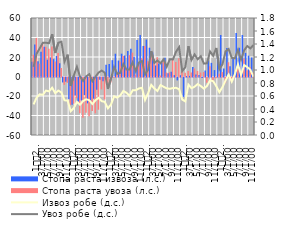
| Category | Стопа раста извоза (л.с.)  | Стопа раста увоза (л.с.)  |
|---|---|---|
| 1
2008. | 15.199 | 22.34 |
| 2 | 32.712 | 39.55 |
| 3 | 15.527 | 13.134 |
| 4 | 25.502 | 34.144 |
| 5 | 30.57 | 30.348 |
| 6 | 17.223 | 28.543 |
| 7 | 19.483 | 30.676 |
| 8 | 17.824 | 15.462 |
| 9 | 21.061 | 24.086 |
| 10 | 13.589 | 8.768 |
| 11 | -5.06 | -7.568 |
| 12 | -4.251 | -5.466 |
| 1
2009. | -22.358 | -28.17 |
| 2 | -27.935 | -26.832 |
| 3 | -18.494 | -21.35 |
| 4 | -24.672 | -36.553 |
| 5 | -23.42 | -41.364 |
| 6 | -18.089 | -36.077 |
| 7 | -26.536 | -39.742 |
| 8 | -25.811 | -34.425 |
| 9 | -21.736 | -36.718 |
| 10 | -12.575 | -33.086 |
| 11 | -2.315 | -12.183 |
| 12 | -3.819 | -22.497 |
| 1
2010. | 12.142 | -5.961 |
| 2 | 12.72 | -5.168 |
| 3 | 16.768 | -0.207 |
| 4 | 23.362 | 4.609 |
| 5 | 16.387 | 15.025 |
| 6 | 23.401 | 21.029 |
| 7 | 21.506 | 7.779 |
| 8 | 26.135 | 21.986 |
| 9 | 28.389 | 24.497 |
| 10 | 20.296 | 2.114 |
| 11 | 37.332 | 12.411 |
| 12 | 42.569 | 18.752 |
| 1
2011. | 31.354 | 31.338 |
| 2 | 37.929 | 15.578 |
| 3 | 29.514 | 23.309 |
| 4 | 24.68 | 17.895 |
| 5 | 11.302 | 19.66 |
| 6 | 13.265 | 1.002 |
| 7 | 14.178 | 15.389 |
| 8 | 19.358 | 4.055 |
| 9 | 3.426 | 4.337 |
| 10 | 4.992 | 18.458 |
| 11 | 1.409 | 14.917 |
| 12 | -2.985 | 18.768 |
| 1
2012. | 1.319 | 5.652 |
| 2 | -19.883 | 3.79 |
| 3 | 0.467 | 5.768 |
| 4 | 0.629 | 4.097 |
| 5 | 9.697 | 8.189 |
| 6 | 1.977 | 5.606 |
| 7 | 1.441 | 4.062 |
| 8 | -0.557 | 4.585 |
| 9 | 6.188 | -5.388 |
| 10 | 16.537 | 10.555 |
| 11 | 14.007 | -4.836 |
| 12 | 6.586 | -0.896 |
| 1
2013. | 20.694 | 2.847 |
| 2 | 42.576 | 4.474 |
| 3 | 8.318 | -5.858 |
| 4 | 29.177 | 14.589 |
| 5 | 10.475 | -4.22 |
| 6 | 19.146 | 1.225 |
| 7 | 44.601 | 8.157 |
| 8 | 29.498 | 5.722 |
| 9 | 42.58 | 18.152 |
| 10 | 24.211 | 6.474 |
| 11 | 21.365 | 9.379 |
| 12 | 19.498 | 3.32 |